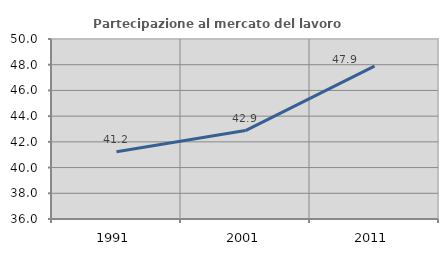
| Category | Partecipazione al mercato del lavoro  femminile |
|---|---|
| 1991.0 | 41.234 |
| 2001.0 | 42.879 |
| 2011.0 | 47.883 |